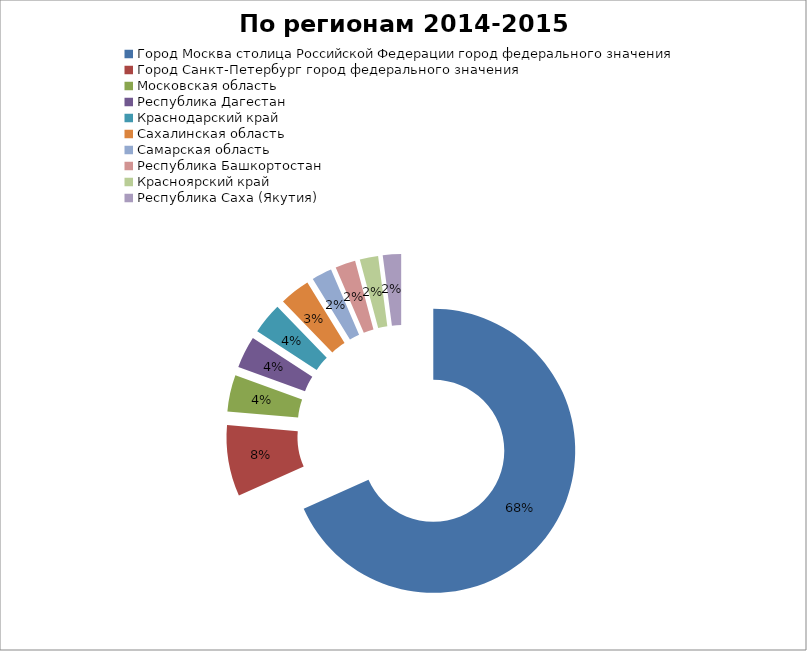
| Category | Series 0 |
|---|---|
| Город Москва столица Российской Федерации город федерального значения | 27357239323 |
| Город Санкт-Петербург город федерального значения | 3241854871 |
| Московская область | 1664078432 |
| Республика Дагестан | 1464767311 |
| Краснодарский край | 1424251297 |
| Сахалинская область | 1388247948 |
| Самарская область | 922635554 |
| Республика Башкортостан | 920668427 |
| Красноярский край | 837270288 |
| Республика Саха (Якутия) | 832518090 |